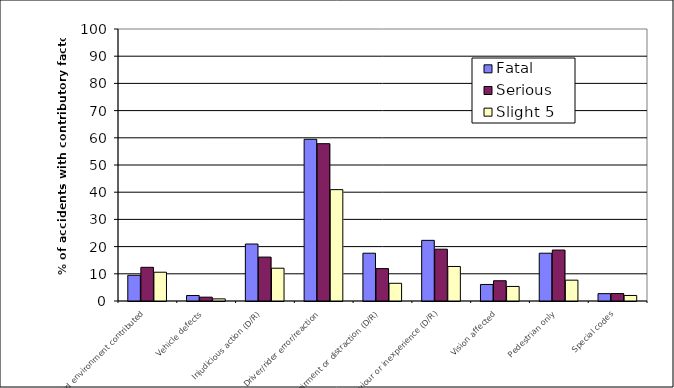
| Category | Fatal | Serious | Slight 5 |
|---|---|---|---|
| Road environment contributed | 9.459 | 12.382 | 10.579 |
| Vehicle defects | 2.027 | 1.411 | 0.785 |
| Injudicious action (D/R) | 20.946 | 16.144 | 12.052 |
| Driver/rider error/reaction | 59.459 | 57.837 | 40.943 |
| Impairment or distraction (D/R) | 17.568 | 11.912 | 6.505 |
| Behaviour or inexperience (D/R) | 22.297 | 19.044 | 12.69 |
| Vision affected | 6.081 | 7.445 | 5.351 |
| Pedestrian only | 17.568 | 18.73 | 7.658 |
| Special codes | 2.703 | 2.743 | 2.037 |